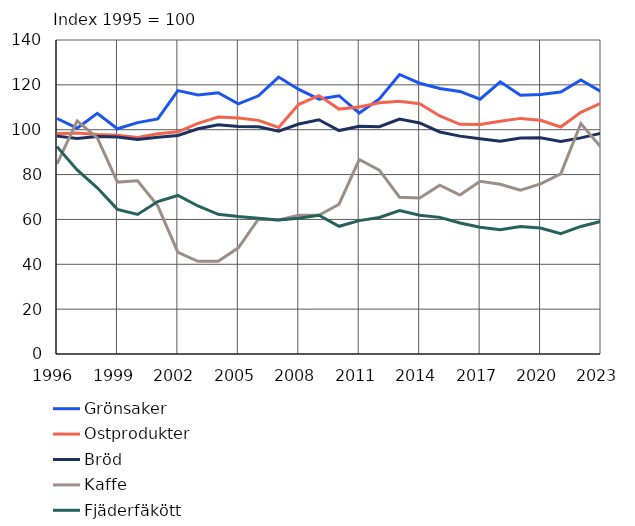
| Category | Grönsaker | Ostprodukter | Bröd | Kaffe | Fjäderfäkött |
|---|---|---|---|---|---|
| 1996.0 | 105 | 98.23 | 97.14 | 84.77 | 92.45 |
| 1997.0 | 100.7 | 98.57 | 96.1 | 103.93 | 82.08 |
| 1998.0 | 107.32 | 97.83 | 96.92 | 96.38 | 74.09 |
| 1999.0 | 100.41 | 97.58 | 96.77 | 76.64 | 64.49 |
| 2000.0 | 103.16 | 96.51 | 95.59 | 77.22 | 62.22 |
| 2001.0 | 104.84 | 98.2 | 96.68 | 66.07 | 67.99 |
| 2002.0 | 117.43 | 99.08 | 97.42 | 45.29 | 70.68 |
| 2003.0 | 115.48 | 102.81 | 100.41 | 41.33 | 66 |
| 2004.0 | 116.48 | 105.64 | 102.22 | 41.38 | 62.29 |
| 2005.0 | 111.53 | 105.24 | 101.45 | 47.35 | 61.3 |
| 2006.0 | 115.11 | 104.16 | 101.36 | 60.22 | 60.53 |
| 2007.0 | 123.48 | 100.99 | 99.35 | 59.72 | 59.79 |
| 2008.0 | 117.95 | 111.32 | 102.55 | 61.85 | 60.48 |
| 2009.0 | 113.65 | 115.2 | 104.46 | 61.81 | 61.86 |
| 2010.0 | 115.15 | 109.19 | 99.62 | 66.78 | 56.93 |
| 2011.0 | 107.41 | 110.09 | 101.5 | 86.71 | 59.46 |
| 2012.0 | 113.75 | 112.03 | 101.33 | 81.95 | 60.85 |
| 2013.0 | 124.62 | 112.73 | 104.76 | 69.91 | 63.92 |
| 2014.0 | 120.73 | 111.6 | 103 | 69.56 | 61.91 |
| 2015.0 | 118.4 | 106.15 | 98.99 | 75.24 | 60.92 |
| 2016.0 | 117.06 | 102.43 | 97.14 | 70.88 | 58.43 |
| 2017.0 | 113.59 | 102.32 | 95.93 | 77.03 | 56.54 |
| 2018.0 | 121.34 | 103.79 | 94.89 | 75.66 | 55.4 |
| 2019.0 | 115.32 | 105.05 | 96.29 | 73.08 | 56.83 |
| 2020.0 | 115.71 | 104.21 | 96.44 | 75.88 | 56.16 |
| 2021.0 | 116.8 | 101.22 | 94.71 | 80.32 | 53.63 |
| 2022.0 | 122.19 | 107.76 | 96.36 | 102.76 | 56.88 |
| 2023.0 | 117 | 111.82 | 98.44 | 92.16 | 59.14 |